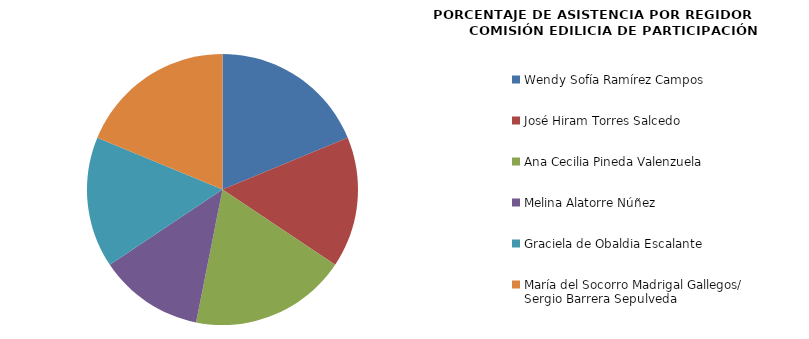
| Category | Series 0 |
|---|---|
| Wendy Sofía Ramírez Campos | 100 |
| José Hiram Torres Salcedo | 83.333 |
| Ana Cecilia Pineda Valenzuela | 100 |
| Melina Alatorre Núñez | 66.667 |
| Graciela de Obaldia Escalante | 83.333 |
| María del Socorro Madrigal Gallegos/
Sergio Barrera Sepulveda | 100 |